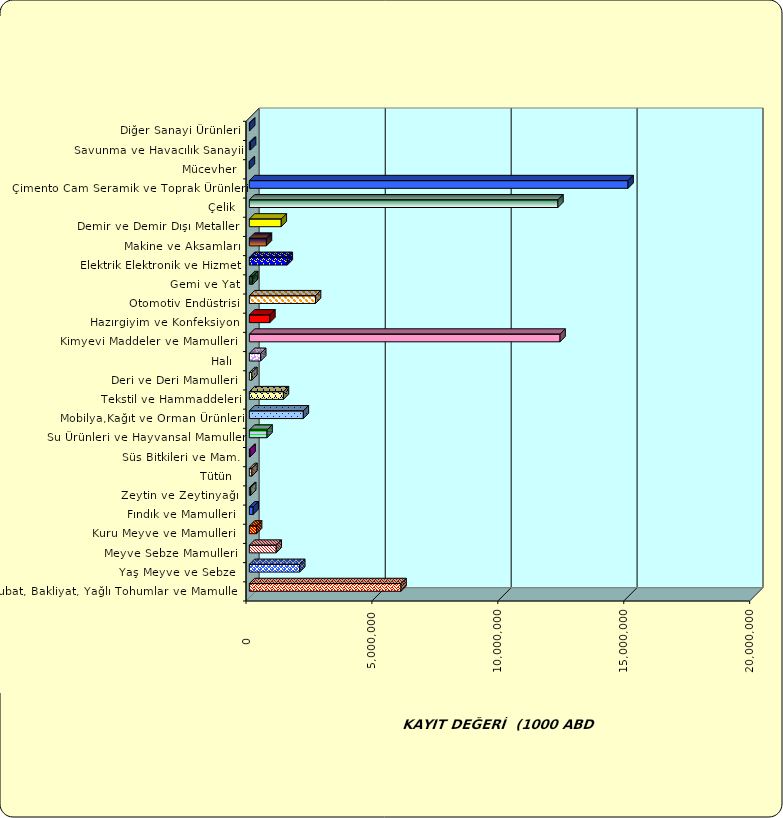
| Category | Series 0 |
|---|---|
|  Hububat, Bakliyat, Yağlı Tohumlar ve Mamulleri  | 6022557.036 |
|  Yaş Meyve ve Sebze   | 2000056.789 |
|  Meyve Sebze Mamulleri  | 1066483.891 |
|  Kuru Meyve ve Mamulleri   | 286016.583 |
|  Fındık ve Mamulleri  | 150631.434 |
|  Zeytin ve Zeytinyağı  | 51997.417 |
|  Tütün  | 103043.584 |
|  Süs Bitkileri ve Mam. | 27411.098 |
|  Su Ürünleri ve Hayvansal Mamuller | 702275.131 |
|  Mobilya,Kağıt ve Orman Ürünleri | 2143804.926 |
|  Tekstil ve Hammaddeleri | 1353207.021 |
|  Deri ve Deri Mamulleri  | 98303.395 |
|  Halı  | 450287.623 |
|  Kimyevi Maddeler ve Mamulleri   | 12337047.997 |
|  Hazırgiyim ve Konfeksiyon  | 814542.504 |
|  Otomotiv Endüstrisi | 2627074.753 |
|  Gemi ve Yat | 134248.693 |
|  Elektrik Elektronik ve Hizmet | 1505462.681 |
|  Makine ve Aksamları | 677775.458 |
|  Demir ve Demir Dışı Metaller  | 1266924.192 |
|  Çelik | 12253282.882 |
|  Çimento Cam Seramik ve Toprak Ürünleri | 15037753.194 |
|  Mücevher | 1960.258 |
|  Savunma ve Havacılık Sanayii | 47131.183 |
|  Diğer Sanayi Ürünleri | 12056.527 |